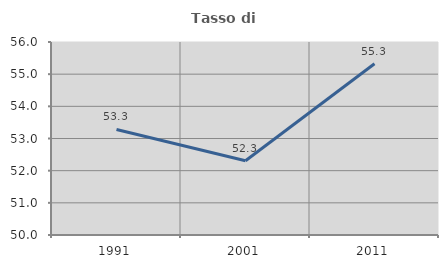
| Category | Tasso di occupazione   |
|---|---|
| 1991.0 | 53.282 |
| 2001.0 | 52.309 |
| 2011.0 | 55.323 |